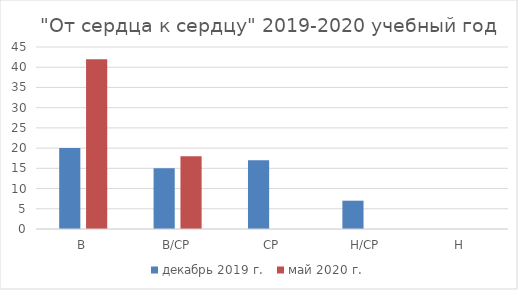
| Category | декабрь 2019 г.  | май 2020 г. |
|---|---|---|
| В | 20 | 42 |
| В/СР | 15 | 18 |
| СР | 17 | 0 |
| Н/СР | 7 | 0 |
| Н | 0 | 0 |